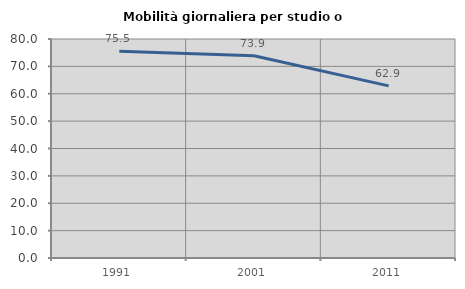
| Category | Mobilità giornaliera per studio o lavoro |
|---|---|
| 1991.0 | 75.516 |
| 2001.0 | 73.887 |
| 2011.0 | 62.871 |